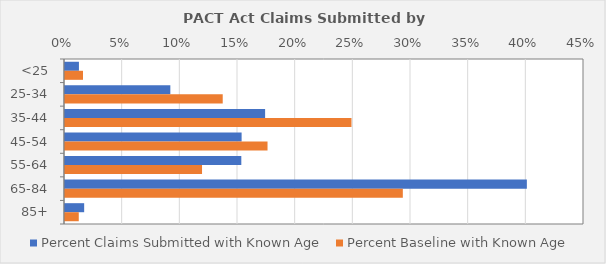
| Category | Percent Claims Submitted with Known Age | Percent Baseline with Known Age |
|---|---|---|
| <25 | 0.012 | 0.016 |
| 25-34 | 0.091 | 0.137 |
| 35-44 | 0.174 | 0.248 |
| 45-54 | 0.153 | 0.176 |
| 55-64 | 0.153 | 0.119 |
| 65-84 | 0.4 | 0.293 |
| 85+ | 0.017 | 0.012 |